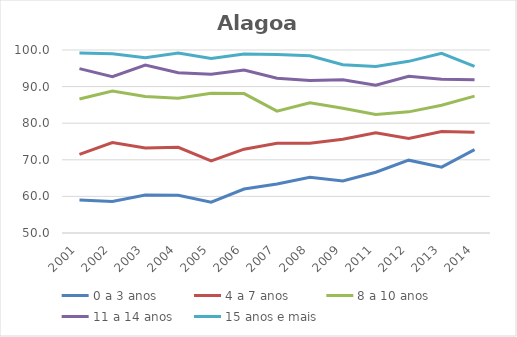
| Category | 0 a 3 anos | 4 a 7 anos | 8 a 10 anos | 11 a 14 anos | 15 anos e mais |
|---|---|---|---|---|---|
| 2001.0 | 59 | 71.5 | 86.6 | 94.9 | 99.2 |
| 2002.0 | 58.6 | 74.7 | 88.8 | 92.7 | 99 |
| 2003.0 | 60.4 | 73.2 | 87.3 | 95.9 | 97.9 |
| 2004.0 | 60.3 | 73.4 | 86.8 | 93.8 | 99.2 |
| 2005.0 | 58.4 | 69.7 | 88.2 | 93.4 | 97.7 |
| 2006.0 | 62 | 72.9 | 88.1 | 94.5 | 98.9 |
| 2007.0 | 63.4 | 74.5 | 83.3 | 92.3 | 98.8 |
| 2008.0 | 65.2 | 74.5 | 85.6 | 91.7 | 98.4 |
| 2009.0 | 64.2 | 75.6 | 84.1 | 91.9 | 96 |
| 2011.0 | 66.6 | 77.4 | 82.4 | 90.4 | 95.5 |
| 2012.0 | 69.9 | 75.8 | 83.1 | 92.8 | 96.9 |
| 2013.0 | 68 | 77.7 | 84.9 | 92 | 99.1 |
| 2014.0 | 72.8 | 77.5 | 87.4 | 91.9 | 95.5 |